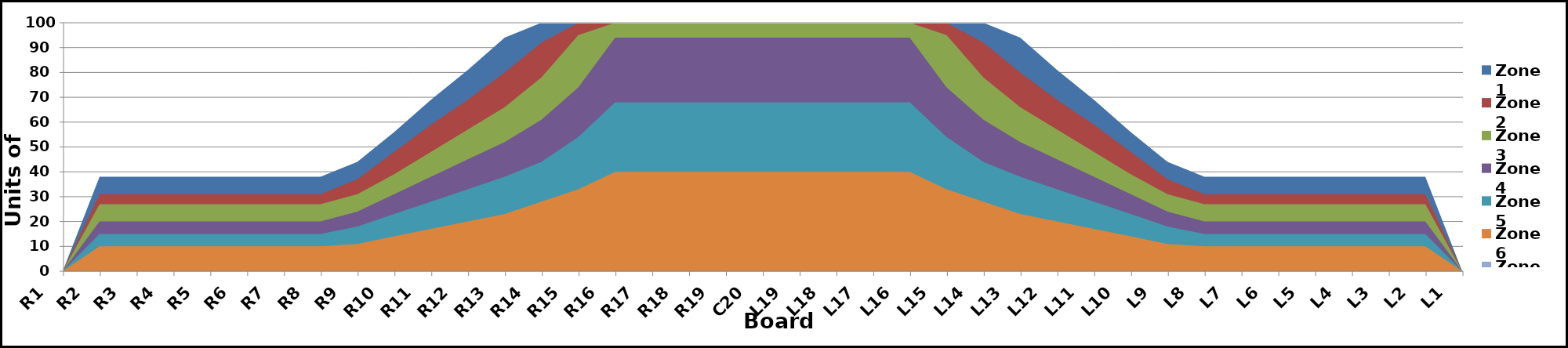
| Category | Zone 1 | Zone 2 | Zone 3 | Zone 4 | Zone 5 | Zone 6 | Zone 7 | Zone 8 |
|---|---|---|---|---|---|---|---|---|
| L1 | 0 | 0 | 0 | 0 | 0 | 0 | 0 | 0 |
| L2 | 38 | 31 | 27 | 20 | 15 | 10 | 0 | 0 |
| L3 | 38 | 31 | 27 | 20 | 15 | 10 | 0 | 0 |
| L4 | 38 | 31 | 27 | 20 | 15 | 10 | 0 | 0 |
| L5 | 38 | 31 | 27 | 20 | 15 | 10 | 0 | 0 |
| L6 | 38 | 31 | 27 | 20 | 15 | 10 | 0 | 0 |
| L7 | 38 | 31 | 27 | 20 | 15 | 10 | 0 | 0 |
| L8 | 38 | 31 | 27 | 20 | 15 | 10 | 0 | 0 |
| L9 | 44 | 37 | 31 | 24 | 18 | 11 | 0 | 0 |
| L10 | 56 | 48 | 39 | 31 | 23 | 14 | 0 | 0 |
| L11 | 69 | 59 | 48 | 38 | 28 | 17 | 0 | 0 |
| L12 | 81 | 69 | 57 | 45 | 33 | 20 | 0 | 0 |
| L13 | 94 | 80 | 66 | 52 | 38 | 23 | 0 | 0 |
| L14 | 100 | 92 | 78 | 61 | 44 | 28 | 0 | 0 |
| L15 | 100 | 100 | 95 | 74 | 54 | 33 | 0 | 0 |
| L16 | 100 | 100 | 100 | 94 | 68 | 40 | 0 | 0 |
| L17 | 100 | 100 | 100 | 94 | 68 | 40 | 0 | 0 |
| L18 | 100 | 100 | 100 | 94 | 68 | 40 | 0 | 0 |
| L19 | 100 | 100 | 100 | 94 | 68 | 40 | 0 | 0 |
| C20 | 100 | 100 | 100 | 94 | 68 | 40 | 0 | 0 |
| R19 | 100 | 100 | 100 | 94 | 68 | 40 | 0 | 0 |
| R18 | 100 | 100 | 100 | 94 | 68 | 40 | 0 | 0 |
| R17 | 100 | 100 | 100 | 94 | 68 | 40 | 0 | 0 |
| R16 | 100 | 100 | 100 | 94 | 68 | 40 | 0 | 0 |
| R15 | 100 | 100 | 95 | 74 | 54 | 33 | 0 | 0 |
| R14 | 100 | 92 | 78 | 61 | 44 | 28 | 0 | 0 |
| R13 | 94 | 80 | 66 | 52 | 38 | 23 | 0 | 0 |
| R12 | 81 | 69 | 57 | 45 | 33 | 20 | 0 | 0 |
| R11 | 69 | 59 | 48 | 38 | 28 | 17 | 0 | 0 |
| R10 | 56 | 48 | 39 | 31 | 23 | 14 | 0 | 0 |
| R9 | 44 | 37 | 31 | 24 | 18 | 11 | 0 | 0 |
| R8 | 38 | 31 | 27 | 20 | 15 | 10 | 0 | 0 |
| R7 | 38 | 31 | 27 | 20 | 15 | 10 | 0 | 0 |
| R6 | 38 | 31 | 27 | 20 | 15 | 10 | 0 | 0 |
| R5 | 38 | 31 | 27 | 20 | 15 | 10 | 0 | 0 |
| R4 | 38 | 31 | 27 | 20 | 15 | 10 | 0 | 0 |
| R3 | 38 | 31 | 27 | 20 | 15 | 10 | 0 | 0 |
| R2 | 38 | 31 | 27 | 20 | 15 | 10 | 0 | 0 |
| R1 | 0 | 0 | 0 | 0 | 0 | 0 | 0 | 0 |